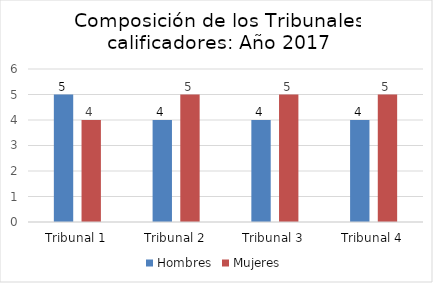
| Category | Hombres | Mujeres |
|---|---|---|
| Tribunal 1 | 5 | 4 |
| Tribunal 2 | 4 | 5 |
| Tribunal 3 | 4 | 5 |
| Tribunal 4 | 4 | 5 |